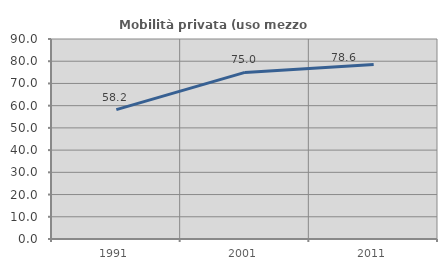
| Category | Mobilità privata (uso mezzo privato) |
|---|---|
| 1991.0 | 58.209 |
| 2001.0 | 74.978 |
| 2011.0 | 78.57 |